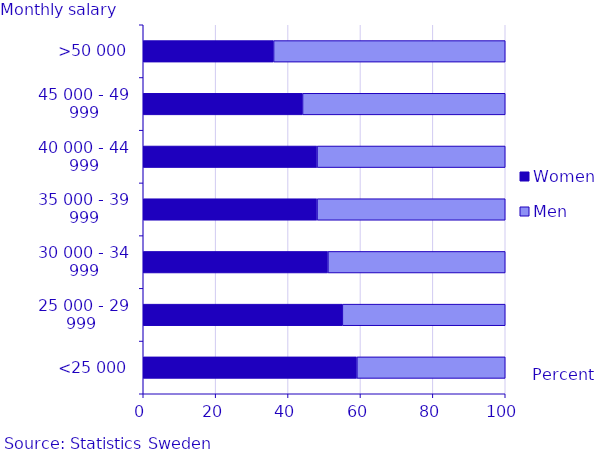
| Category | Women | Men |
|---|---|---|
| <25 000 | 59 | 41 |
| 25 000 - 29 999  | 55 | 45 |
| 30 000 - 34 999 | 51 | 49 |
| 35 000 - 39 999 | 48 | 52 |
| 40 000 - 44 999 | 48 | 52 |
| 45 000 - 49 999 | 44 | 56 |
| >50 000 | 36 | 64 |